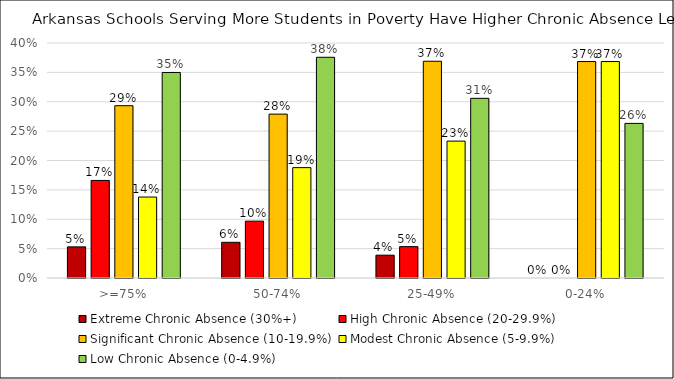
| Category | Extreme Chronic Absence (30%+) | High Chronic Absence (20-29.9%) | Significant Chronic Absence (10-19.9%) | Modest Chronic Absence (5-9.9%) | Low Chronic Absence (0-4.9%) |
|---|---|---|---|---|---|
| >=75% | 0.053 | 0.166 | 0.293 | 0.138 | 0.35 |
| 50-74% | 0.061 | 0.097 | 0.279 | 0.188 | 0.376 |
| 25-49% | 0.039 | 0.053 | 0.369 | 0.233 | 0.306 |
| 0-24% | 0 | 0 | 0.368 | 0.368 | 0.263 |